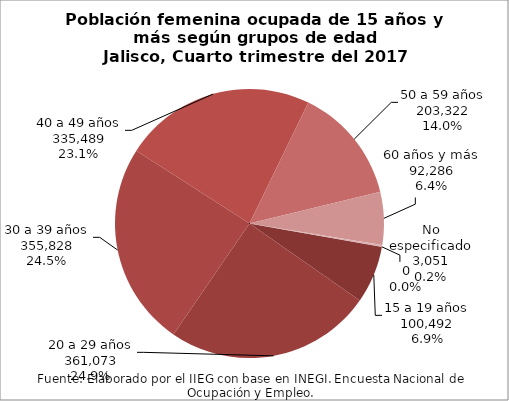
| Category | Series 0 |
|---|---|
| 15 a 19 años | 100492 |
| 20 a 29 años | 361073 |
| 30 a 39 años | 355828 |
| 40 a 49 años | 335489 |
| 50 a 59 años | 203322 |
| 60 años y más | 92286 |
| No especificado | 3051 |